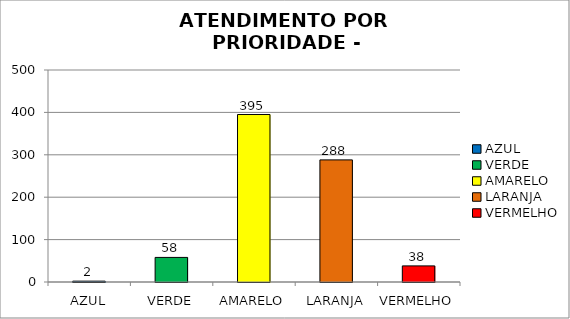
| Category | Total Regional: |
|---|---|
| AZUL | 2 |
| VERDE | 58 |
| AMARELO | 395 |
| LARANJA | 288 |
| VERMELHO | 38 |